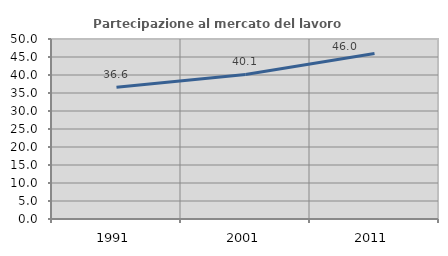
| Category | Partecipazione al mercato del lavoro  femminile |
|---|---|
| 1991.0 | 36.599 |
| 2001.0 | 40.141 |
| 2011.0 | 45.977 |